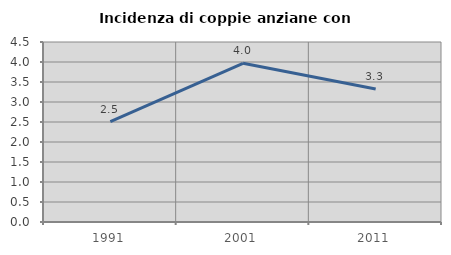
| Category | Incidenza di coppie anziane con figli |
|---|---|
| 1991.0 | 2.512 |
| 2001.0 | 3.968 |
| 2011.0 | 3.327 |